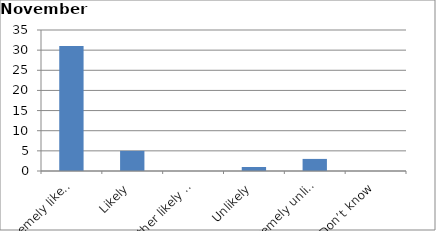
| Category | Series 0 |
|---|---|
| Extremely likely | 31 |
| Likely | 5 |
| Neither likely nor unlikely | 0 |
| Unlikely | 1 |
| Extremely unlikely | 3 |
| Don’t know | 0 |